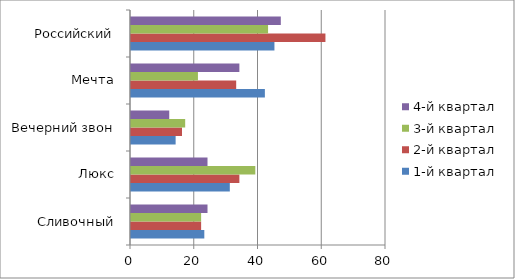
| Category | 1-й квартал | 2-й квартал | 3-й квартал | 4-й квартал |
|---|---|---|---|---|
| Сливочный | 23 | 22 | 22 | 24 |
| Люкс | 31 | 34 | 39 | 24 |
| Вечерний звон | 14 | 16 | 17 | 12 |
| Мечта | 42 | 33 | 21 | 34 |
| Российский | 45 | 61 | 43 | 47 |